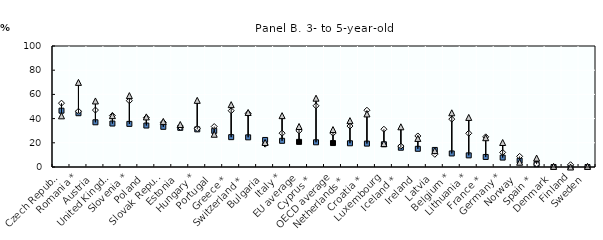
| Category | 1st tertile (lowest) | 2nd tertile | 3rd tertile (highest) |
|---|---|---|---|
| Czech Republic | 46.542 | 52.764 | 42.279 |
| Romania * | 44.457 | 46.079 | 69.935 |
| Austria | 36.947 | 47.061 | 54.579 |
| United Kingdom | 35.915 | 42.5 | 42.433 |
| Slovenia * | 35.639 | 54.778 | 59.009 |
| Poland | 34.261 | 40.779 | 41.412 |
| Slovak Republic | 33.196 | 36.924 | 37.661 |
| Estonia | 32.38 | 32.836 | 35.104 |
| Hungary * | 31.109 | 31.733 | 55.077 |
| Portugal | 29.879 | 33.424 | 27.077 |
| Greece * | 24.672 | 46.502 | 51.53 |
| Switzerland * | 24.517 | 44.32 | 45.06 |
| Bulgaria | 22.341 | 18.883 | 20.253 |
| Italy * | 21.639 | 27.953 | 42.445 |
| EU average | 20.754 | 29.889 | 33.483 |
| Cyprus * | 20.429 | 50.587 | 56.878 |
| OECD average | 19.794 | 27.98 | 30.934 |
| Netherlands * | 19.609 | 33.85 | 38.306 |
| Croatia * | 19.327 | 46.921 | 43.878 |
| Luxembourg | 18.791 | 31.217 | 19.365 |
| Iceland * | 15.929 | 17.235 | 33.219 |
| Ireland | 15.038 | 25.638 | 23.614 |
| Latvia | 14.089 | 10.487 | 13.555 |
| Belgium * | 11.195 | 39.567 | 44.787 |
| Lithuania * | 9.616 | 27.877 | 40.969 |
| France * | 8.301 | 24.91 | 24.201 |
| Germany * | 7.776 | 12.073 | 20.24 |
| Norway | 5.239 | 8.773 | 3.94 |
| Spain * | 2.365 | 2.421 | 7.376 |
| Denmark | 0 | 0 | 0.519 |
| Finland | 0 | 1.861 | 0 |
| Sweden | 0 | 0 | 0.519 |